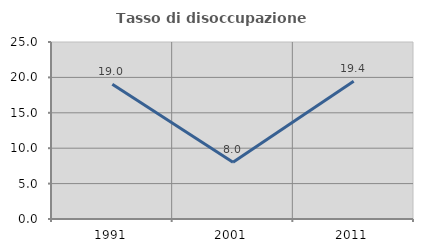
| Category | Tasso di disoccupazione giovanile  |
|---|---|
| 1991.0 | 19.048 |
| 2001.0 | 8 |
| 2011.0 | 19.444 |